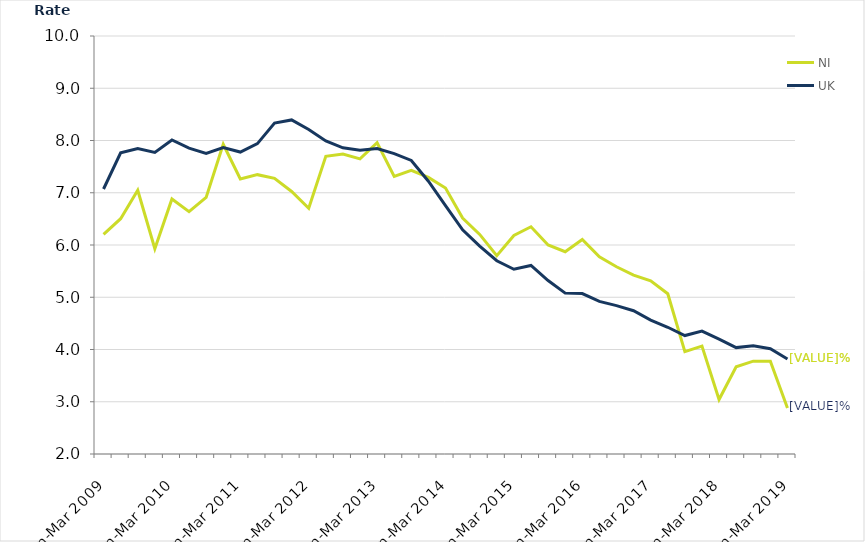
| Category | NI | UK |
|---|---|---|
| Jan-Mar 2009 | 6.205 | 7.072 |
| Apr-Jun 2009 | 6.503 | 7.764 |
| Jul-Sep 2009 | 7.048 | 7.847 |
| Oct-Dec 2009 | 5.928 | 7.773 |
| Jan-Mar 2010 | 6.881 | 8.01 |
| Apr-Jun 2010 | 6.638 | 7.852 |
| Jul-Sep 2010 | 6.912 | 7.755 |
| Oct-Dec 2010 | 7.928 | 7.863 |
| Jan-Mar 2011 | 7.263 | 7.778 |
| Apr-Jun 2011 | 7.346 | 7.94 |
| Jul-Sep 2011 | 7.276 | 8.333 |
| Oct-Dec 2011 | 7.024 | 8.394 |
| Jan-Mar 2012 | 6.703 | 8.21 |
| Apr-Jun 2012 | 7.696 | 7.992 |
| Jul-Sep 2012 | 7.741 | 7.86 |
| Oct-Dec 2012 | 7.647 | 7.814 |
| Jan-Mar 2013 | 7.957 | 7.845 |
| Apr-Jun 2013 | 7.315 | 7.748 |
| Jul-Sep 2013 | 7.429 | 7.618 |
| Oct-Dec 2013 | 7.293 | 7.221 |
| Jan-Mar 2014 | 7.089 | 6.755 |
| Apr-Jun 2014 | 6.515 | 6.289 |
| Jul-Sep 2014 | 6.203 | 5.981 |
| Oct-Dec 2014 | 5.795 | 5.699 |
| Jan-Mar 2015 | 6.182 | 5.536 |
| Apr-Jun 2015 | 6.349 | 5.609 |
| Jul-Sep 2015 | 6.002 | 5.319 |
| Oct-Dec 2015 | 5.871 | 5.079 |
| Jan-Mar 2016 | 6.107 | 5.071 |
| Apr-Jun 2016 | 5.775 | 4.921 |
| Jul-Sep 2016 | 5.583 | 4.839 |
| Oct-Dec 2016 | 5.424 | 4.742 |
| Jan-Mar 2017 | 5.315 | 4.563 |
| Apr-Jun 2017 | 5.068 | 4.425 |
| Jul-Sep 2017 | 3.958 | 4.267 |
| Oct-Dec 2017 | 4.065 | 4.352 |
| Jan-Mar 2018 | 3.043 | 4.198 |
| Apr-Jun 2018 | 3.67 | 4.037 |
| Jul-Sep 2018 | 3.776 | 4.073 |
| Oct-Dec 2018 | 3.776 | 4.014 |
| Jan-Mar 2019 | 2.88 | 3.818 |